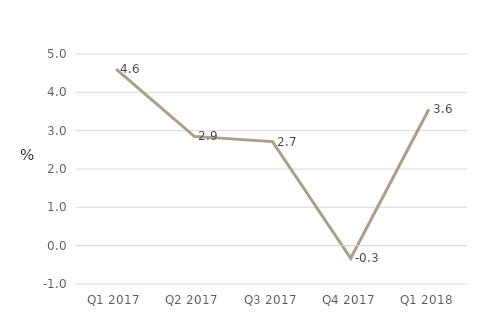
| Category | Financial companies |
|---|---|
| Q1 2017 | 4.606 |
| Q2 2017 | 2.851 |
| Q3 2017 | 2.714 |
| Q4 2017 | -0.33 |
| Q1 2018 | 3.56 |